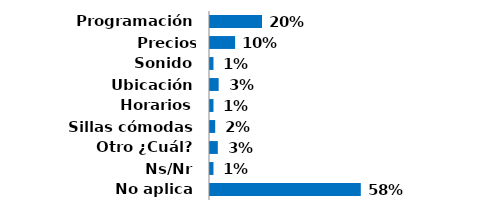
| Category | Series 0 |
|---|---|
| Programación | 0.2 |
| Precios cómodos | 0.097 |
| Sonido | 0.013 |
| Ubicación | 0.033 |
| Horarios | 0.013 |
| Sillas cómodas | 0.02 |
| Otro ¿Cuál? | 0.03 |
| Ns/Nr | 0.013 |
| No aplica | 0.58 |